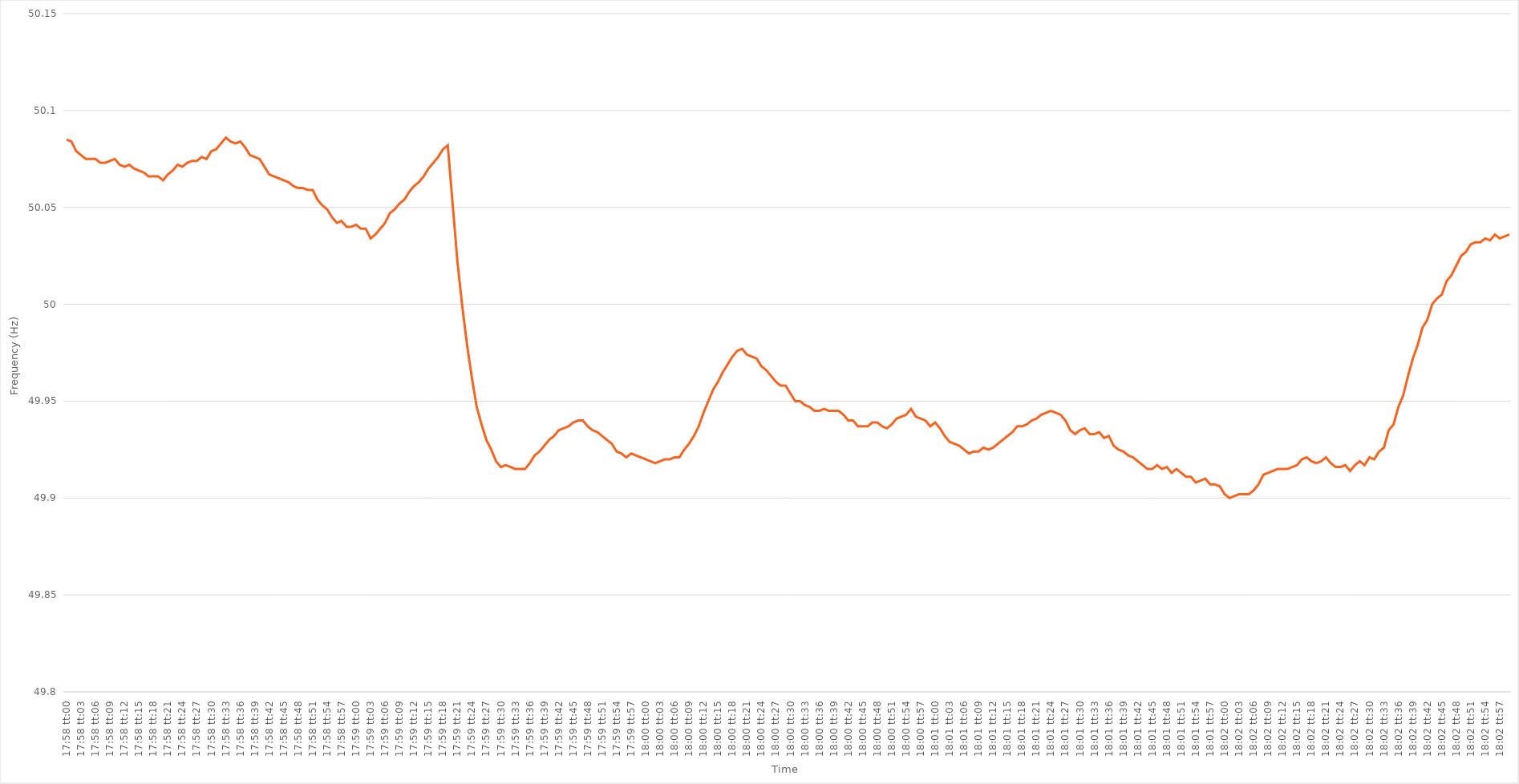
| Category | Series 0 |
|---|---|
| 0.748611111111111 | 50.085 |
| 0.7486226851851852 | 50.084 |
| 0.7486342592592593 | 50.079 |
| 0.7486458333333333 | 50.077 |
| 0.7486574074074074 | 50.075 |
| 0.7486689814814814 | 50.075 |
| 0.7486805555555556 | 50.075 |
| 0.7486921296296297 | 50.073 |
| 0.7487037037037036 | 50.073 |
| 0.7487152777777778 | 50.074 |
| 0.7487268518518518 | 50.075 |
| 0.748738425925926 | 50.072 |
| 0.7487499999999999 | 50.071 |
| 0.7487615740740741 | 50.072 |
| 0.7487731481481482 | 50.07 |
| 0.7487847222222223 | 50.069 |
| 0.7487962962962963 | 50.068 |
| 0.7488078703703703 | 50.066 |
| 0.7488194444444445 | 50.066 |
| 0.7488310185185186 | 50.066 |
| 0.7488425925925926 | 50.064 |
| 0.7488541666666667 | 50.067 |
| 0.7488657407407407 | 50.069 |
| 0.7488773148148148 | 50.072 |
| 0.7488888888888888 | 50.071 |
| 0.748900462962963 | 50.073 |
| 0.7489120370370371 | 50.074 |
| 0.748923611111111 | 50.074 |
| 0.7489351851851852 | 50.076 |
| 0.7489467592592592 | 50.075 |
| 0.7489583333333334 | 50.079 |
| 0.7489699074074073 | 50.08 |
| 0.7489814814814815 | 50.083 |
| 0.7489930555555556 | 50.086 |
| 0.7490046296296297 | 50.084 |
| 0.7490162037037037 | 50.083 |
| 0.7490277777777777 | 50.084 |
| 0.7490393518518519 | 50.081 |
| 0.749050925925926 | 50.077 |
| 0.7490625 | 50.076 |
| 0.7490740740740741 | 50.075 |
| 0.7490856481481482 | 50.071 |
| 0.7490972222222222 | 50.067 |
| 0.7491087962962962 | 50.066 |
| 0.7491203703703704 | 50.065 |
| 0.7491319444444445 | 50.064 |
| 0.7491435185185185 | 50.063 |
| 0.7491550925925926 | 50.061 |
| 0.7491666666666666 | 50.06 |
| 0.7491782407407408 | 50.06 |
| 0.7491898148148147 | 50.059 |
| 0.7492013888888889 | 50.059 |
| 0.749212962962963 | 50.054 |
| 0.7492245370370371 | 50.051 |
| 0.7492361111111111 | 50.049 |
| 0.7492476851851851 | 50.045 |
| 0.7492592592592593 | 50.042 |
| 0.7492708333333334 | 50.043 |
| 0.7492824074074074 | 50.04 |
| 0.7492939814814815 | 50.04 |
| 0.7493055555555556 | 50.041 |
| 0.7493171296296296 | 50.039 |
| 0.7493287037037036 | 50.039 |
| 0.7493402777777778 | 50.034 |
| 0.7493518518518519 | 50.036 |
| 0.7493634259259259 | 50.039 |
| 0.749375 | 50.042 |
| 0.749386574074074 | 50.047 |
| 0.7493981481481482 | 50.049 |
| 0.7494097222222221 | 50.052 |
| 0.7494212962962963 | 50.054 |
| 0.7494328703703704 | 50.058 |
| 0.7494444444444445 | 50.061 |
| 0.7494560185185185 | 50.063 |
| 0.7494675925925925 | 50.066 |
| 0.7494791666666667 | 50.07 |
| 0.7494907407407408 | 50.073 |
| 0.7495023148148148 | 50.076 |
| 0.7495138888888889 | 50.08 |
| 0.749525462962963 | 50.082 |
| 0.749537037037037 | 50.052 |
| 0.749548611111111 | 50.022 |
| 0.7495601851851852 | 49.999 |
| 0.7495717592592593 | 49.979 |
| 0.7495833333333333 | 49.962 |
| 0.7495949074074074 | 49.947 |
| 0.7496064814814815 | 49.938 |
| 0.7496180555555556 | 49.93 |
| 0.7496296296296295 | 49.925 |
| 0.7496412037037037 | 49.919 |
| 0.7496527777777778 | 49.916 |
| 0.7496643518518519 | 49.917 |
| 0.7496759259259259 | 49.916 |
| 0.7496875 | 49.915 |
| 0.7496990740740741 | 49.915 |
| 0.7497106481481483 | 49.915 |
| 0.7497222222222222 | 49.918 |
| 0.7497337962962963 | 49.922 |
| 0.7497453703703704 | 49.924 |
| 0.7497569444444444 | 49.927 |
| 0.7497685185185184 | 49.93 |
| 0.7497800925925926 | 49.932 |
| 0.7497916666666667 | 49.935 |
| 0.7498032407407407 | 49.936 |
| 0.7498148148148148 | 49.937 |
| 0.7498263888888889 | 49.939 |
| 0.749837962962963 | 49.94 |
| 0.7498495370370369 | 49.94 |
| 0.7498611111111111 | 49.937 |
| 0.7498726851851852 | 49.935 |
| 0.7498842592592593 | 49.934 |
| 0.7498958333333333 | 49.932 |
| 0.7499074074074074 | 49.93 |
| 0.7499189814814815 | 49.928 |
| 0.7499305555555557 | 49.924 |
| 0.7499421296296296 | 49.923 |
| 0.7499537037037037 | 49.921 |
| 0.7499652777777778 | 49.923 |
| 0.7499768518518519 | 49.922 |
| 0.7499884259259259 | 49.921 |
| 0.75 | 49.92 |
| 0.7500115740740741 | 49.919 |
| 0.7500231481481481 | 49.918 |
| 0.7500347222222222 | 49.919 |
| 0.7500462962962963 | 49.92 |
| 0.7500578703703704 | 49.92 |
| 0.7500694444444443 | 49.921 |
| 0.7500810185185185 | 49.921 |
| 0.7500925925925926 | 49.925 |
| 0.7501041666666667 | 49.928 |
| 0.7501157407407407 | 49.932 |
| 0.7501273148148148 | 49.937 |
| 0.7501388888888889 | 49.944 |
| 0.7501504629629631 | 49.95 |
| 0.750162037037037 | 49.956 |
| 0.7501736111111111 | 49.96 |
| 0.7501851851851852 | 49.965 |
| 0.7501967592592593 | 49.969 |
| 0.7502083333333333 | 49.973 |
| 0.7502199074074074 | 49.976 |
| 0.7502314814814816 | 49.977 |
| 0.7502430555555555 | 49.974 |
| 0.7502546296296296 | 49.973 |
| 0.7502662037037037 | 49.972 |
| 0.7502777777777778 | 49.968 |
| 0.7502893518518517 | 49.966 |
| 0.7503009259259259 | 49.963 |
| 0.7503125 | 49.96 |
| 0.7503240740740741 | 49.958 |
| 0.7503356481481481 | 49.958 |
| 0.7503472222222222 | 49.954 |
| 0.7503587962962963 | 49.95 |
| 0.7503703703703705 | 49.95 |
| 0.7503819444444444 | 49.948 |
| 0.7503935185185185 | 49.947 |
| 0.7504050925925926 | 49.945 |
| 0.7504166666666667 | 49.945 |
| 0.7504282407407407 | 49.946 |
| 0.7504398148148148 | 49.945 |
| 0.750451388888889 | 49.945 |
| 0.750462962962963 | 49.945 |
| 0.750474537037037 | 49.943 |
| 0.7504861111111111 | 49.94 |
| 0.7504976851851852 | 49.94 |
| 0.7505092592592592 | 49.937 |
| 0.7505208333333333 | 49.937 |
| 0.7505324074074075 | 49.937 |
| 0.7505439814814815 | 49.939 |
| 0.7505555555555555 | 49.939 |
| 0.7505671296296296 | 49.937 |
| 0.7505787037037037 | 49.936 |
| 0.7505902777777779 | 49.938 |
| 0.7506018518518518 | 49.941 |
| 0.750613425925926 | 49.942 |
| 0.750625 | 49.943 |
| 0.7506365740740741 | 49.946 |
| 0.7506481481481481 | 49.942 |
| 0.7506597222222222 | 49.941 |
| 0.7506712962962964 | 49.94 |
| 0.7506828703703704 | 49.937 |
| 0.7506944444444444 | 49.939 |
| 0.7507060185185185 | 49.936 |
| 0.7507175925925926 | 49.932 |
| 0.7507291666666666 | 49.929 |
| 0.7507407407407407 | 49.928 |
| 0.7507523148148149 | 49.927 |
| 0.7507638888888889 | 49.925 |
| 0.7507754629629629 | 49.923 |
| 0.750787037037037 | 49.924 |
| 0.7507986111111111 | 49.924 |
| 0.7508101851851853 | 49.926 |
| 0.7508217592592592 | 49.925 |
| 0.7508333333333334 | 49.926 |
| 0.7508449074074074 | 49.928 |
| 0.7508564814814815 | 49.93 |
| 0.7508680555555555 | 49.932 |
| 0.7508796296296296 | 49.934 |
| 0.7508912037037038 | 49.937 |
| 0.7509027777777778 | 49.937 |
| 0.7509143518518518 | 49.938 |
| 0.7509259259259259 | 49.94 |
| 0.7509375 | 49.941 |
| 0.750949074074074 | 49.943 |
| 0.7509606481481481 | 49.944 |
| 0.7509722222222223 | 49.945 |
| 0.7509837962962963 | 49.944 |
| 0.7509953703703703 | 49.943 |
| 0.7510069444444444 | 49.94 |
| 0.7510185185185185 | 49.935 |
| 0.7510300925925927 | 49.933 |
| 0.7510416666666666 | 49.935 |
| 0.7510532407407408 | 49.936 |
| 0.7510648148148148 | 49.933 |
| 0.751076388888889 | 49.933 |
| 0.7510879629629629 | 49.934 |
| 0.751099537037037 | 49.931 |
| 0.7511111111111112 | 49.932 |
| 0.7511226851851852 | 49.927 |
| 0.7511342592592593 | 49.925 |
| 0.7511458333333333 | 49.924 |
| 0.7511574074074074 | 49.922 |
| 0.7511689814814816 | 49.921 |
| 0.7511805555555555 | 49.919 |
| 0.7511921296296297 | 49.917 |
| 0.7512037037037037 | 49.915 |
| 0.7512152777777777 | 49.915 |
| 0.7512268518518518 | 49.917 |
| 0.7512384259259259 | 49.915 |
| 0.7512500000000001 | 49.916 |
| 0.751261574074074 | 49.913 |
| 0.7512731481481482 | 49.915 |
| 0.7512847222222222 | 49.913 |
| 0.7512962962962964 | 49.911 |
| 0.7513078703703703 | 49.911 |
| 0.7513194444444444 | 49.908 |
| 0.7513310185185186 | 49.909 |
| 0.7513425925925926 | 49.91 |
| 0.7513541666666667 | 49.907 |
| 0.7513657407407407 | 49.907 |
| 0.7513773148148148 | 49.906 |
| 0.751388888888889 | 49.902 |
| 0.7514004629629629 | 49.9 |
| 0.7514120370370371 | 49.901 |
| 0.7514236111111111 | 49.902 |
| 0.7514351851851852 | 49.902 |
| 0.7514467592592592 | 49.902 |
| 0.7514583333333333 | 49.904 |
| 0.7514699074074075 | 49.907 |
| 0.7514814814814814 | 49.912 |
| 0.7514930555555556 | 49.913 |
| 0.7515046296296296 | 49.914 |
| 0.7515162037037038 | 49.915 |
| 0.7515277777777777 | 49.915 |
| 0.7515393518518518 | 49.915 |
| 0.751550925925926 | 49.916 |
| 0.7515625 | 49.917 |
| 0.7515740740740741 | 49.92 |
| 0.7515856481481481 | 49.921 |
| 0.7515972222222222 | 49.919 |
| 0.7516087962962964 | 49.918 |
| 0.7516203703703703 | 49.919 |
| 0.7516319444444445 | 49.921 |
| 0.7516435185185185 | 49.918 |
| 0.7516550925925927 | 49.916 |
| 0.7516666666666666 | 49.916 |
| 0.7516782407407407 | 49.917 |
| 0.7516898148148149 | 49.914 |
| 0.7517013888888888 | 49.917 |
| 0.751712962962963 | 49.919 |
| 0.751724537037037 | 49.917 |
| 0.7517361111111112 | 49.921 |
| 0.7517476851851851 | 49.92 |
| 0.7517592592592592 | 49.924 |
| 0.7517708333333334 | 49.926 |
| 0.7517824074074074 | 49.935 |
| 0.7517939814814815 | 49.938 |
| 0.7518055555555555 | 49.947 |
| 0.7518171296296297 | 49.953 |
| 0.7518287037037038 | 49.963 |
| 0.7518402777777777 | 49.972 |
| 0.7518518518518519 | 49.979 |
| 0.7518634259259259 | 49.988 |
| 0.7518750000000001 | 49.992 |
| 0.751886574074074 | 50 |
| 0.7518981481481481 | 50.003 |
| 0.7519097222222223 | 50.005 |
| 0.7519212962962962 | 50.012 |
| 0.7519328703703704 | 50.015 |
| 0.7519444444444444 | 50.02 |
| 0.7519560185185186 | 50.025 |
| 0.7519675925925925 | 50.027 |
| 0.7519791666666666 | 50.031 |
| 0.7519907407407408 | 50.032 |
| 0.7520023148148148 | 50.032 |
| 0.7520138888888889 | 50.034 |
| 0.7520254629629629 | 50.033 |
| 0.7520370370370371 | 50.036 |
| 0.7520486111111112 | 50.034 |
| 0.7520601851851851 | 50.035 |
| 0.7520717592592593 | 50.036 |